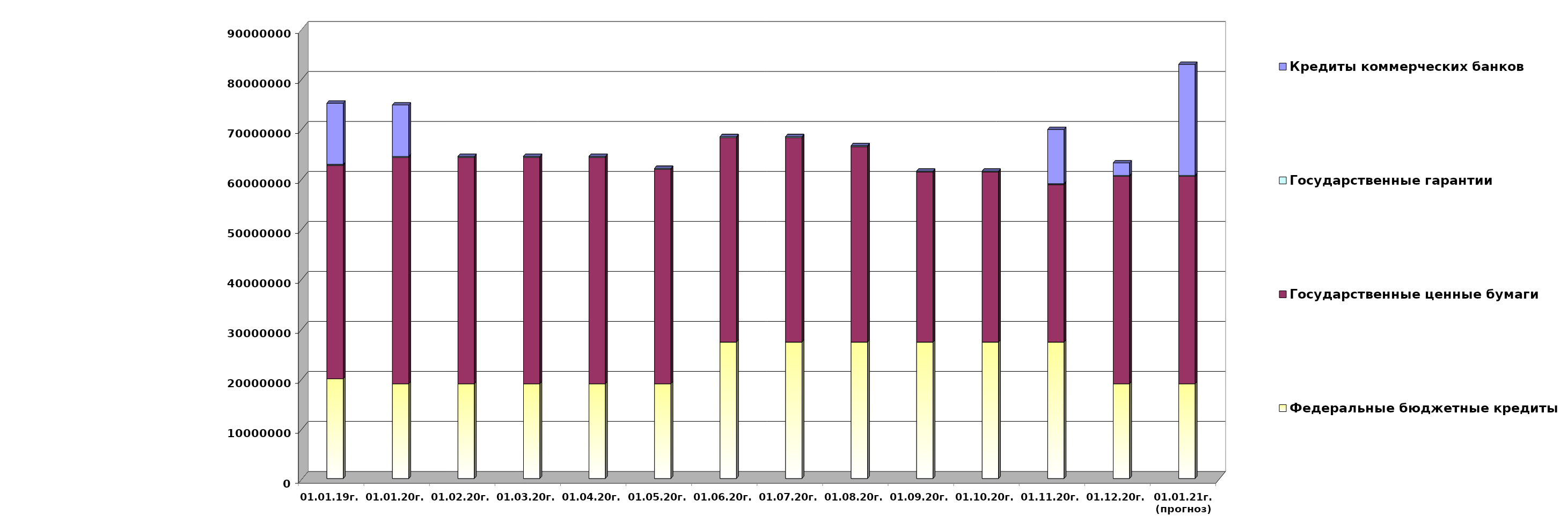
| Category | Федеральные бюджетные кредиты | Государственные ценные бумаги  | Государственные гарантии | Кредиты коммерческих банков |
|---|---|---|---|---|
| 01.01.19г. | 19957026.213 | 42700000 | 209872.86 | 12219963.75 |
| 01.01.20г. | 18954967.463 | 45300000 | 186330.02 | 10291177 |
| 01.02.20г. | 18954967.463 | 45300000 | 184738.25 | 0 |
| 01.03.20г. | 18954967.463 | 45300000 | 184738.25 | 0 |
| 01.04.20г. | 18954967.463 | 45300000 | 184738.25 | 0 |
| 01.05.20г. | 18954967.463 | 42900000 | 184738.25 | 0 |
| 01.06.20г. | 27303300.463 | 40900000 | 184738.25 | 0 |
| 01.07.20г. | 27303300.463 | 40900000 | 184738.25 | 0 |
| 01.08.20г. | 27303300.463 | 39100000 | 184738.25 | 0 |
| 01.09.20г. | 27303300.463 | 34000000 | 184738.25 | 0 |
| 01.10.20г. | 27303300.463 | 34000000 | 184738.25 | 0 |
| 01.11.20г. | 27303300.463 | 31500000 | 184738.25 | 10848333 |
| 01.12.20г. | 18954967.463 | 41500000 | 184738.25 | 2500000 |
| 01.01.21г.
(прогноз) | 18954967.5 | 41500000 | 184738.2 | 22225858.3 |